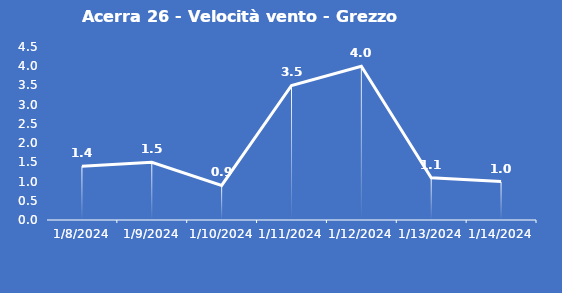
| Category | Acerra 26 - Velocità vento - Grezzo (m/s) |
|---|---|
| 1/8/24 | 1.4 |
| 1/9/24 | 1.5 |
| 1/10/24 | 0.9 |
| 1/11/24 | 3.5 |
| 1/12/24 | 4 |
| 1/13/24 | 1.1 |
| 1/14/24 | 1 |